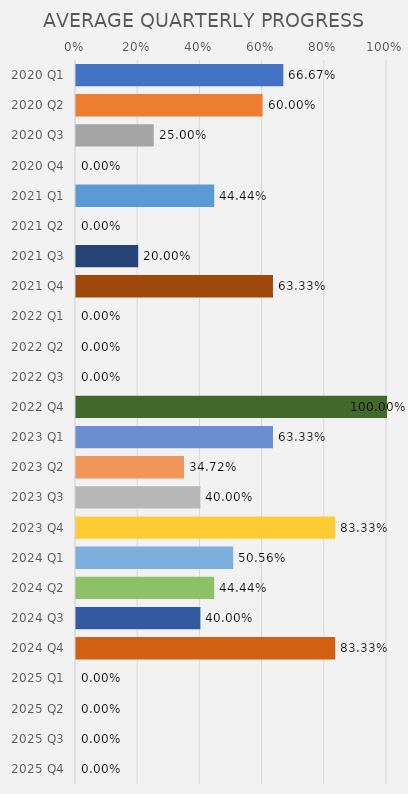
| Category | Series 0 |
|---|---|
| 2020 Q1 | 0.667 |
| 2020 Q2 | 0.6 |
| 2020 Q3 | 0.25 |
| 2020 Q4 | 0 |
| 2021 Q1 | 0.444 |
| 2021 Q2 | 0 |
| 2021 Q3 | 0.2 |
| 2021 Q4 | 0.633 |
| 2022 Q1 | 0 |
| 2022 Q2 | 0 |
| 2022 Q3 | 0 |
| 2022 Q4 | 1 |
| 2023 Q1 | 0.633 |
| 2023 Q2 | 0.347 |
| 2023 Q3 | 0.4 |
| 2023 Q4 | 0.833 |
| 2024 Q1 | 0.506 |
| 2024 Q2 | 0.444 |
| 2024 Q3 | 0.4 |
| 2024 Q4 | 0.833 |
| 2025 Q1 | 0 |
| 2025 Q2 | 0 |
| 2025 Q3 | 0 |
| 2025 Q4 | 0 |